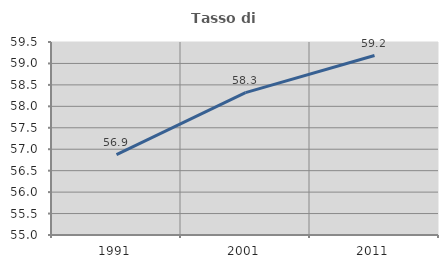
| Category | Tasso di occupazione   |
|---|---|
| 1991.0 | 56.872 |
| 2001.0 | 58.319 |
| 2011.0 | 59.185 |